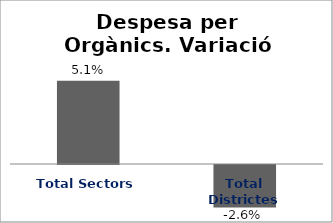
| Category | Series 0 |
|---|---|
| Total Sectors | 0.051 |
| Total Districtes | -0.026 |